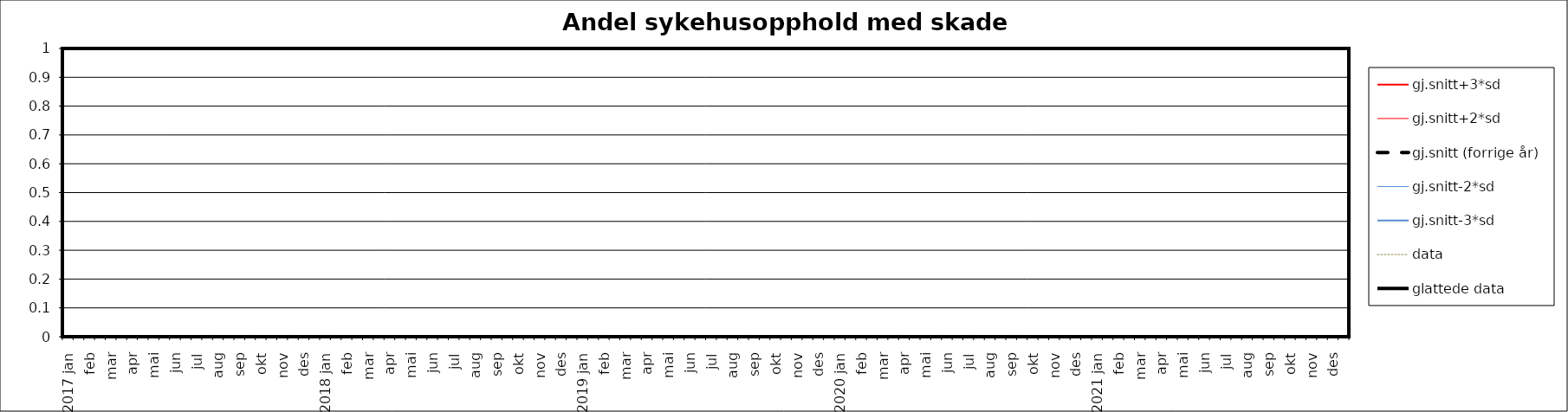
| Category | gj.snitt+3*sd | gj.snitt+2*sd | gj.snitt (forrige år) | gj.snitt-2*sd | gj.snitt-3*sd | data | glattede data |
|---|---|---|---|---|---|---|---|
| 2017 jan | 0 | 0 | 0 | 0 | 0 | 0 | 0 |
|  | 0 | 0 | 0 | 0 | 0 | 0 | 0 |
| feb | 0 | 0 | 0 | 0 | 0 | 0 | 0 |
|  | 0 | 0 | 0 | 0 | 0 | 0 | 0 |
| mar | 0 | 0 | 0 | 0 | 0 | 0 | 0 |
|  | 0 | 0 | 0 | 0 | 0 | 0 | 0 |
| apr | 0 | 0 | 0 | 0 | 0 | 0 | 0 |
|  | 0 | 0 | 0 | 0 | 0 | 0 | 0 |
| mai | 0 | 0 | 0 | 0 | 0 | 0 | 0 |
|  | 0 | 0 | 0 | 0 | 0 | 0 | 0 |
| jun | 0 | 0 | 0 | 0 | 0 | 0 | 0 |
|  | 0 | 0 | 0 | 0 | 0 | 0 | 0 |
| jul | 0 | 0 | 0 | 0 | 0 | 0 | 0 |
|  | 0 | 0 | 0 | 0 | 0 | 0 | 0 |
| aug | 0 | 0 | 0 | 0 | 0 | 0 | 0 |
|  | 0 | 0 | 0 | 0 | 0 | 0 | 0 |
| sep | 0 | 0 | 0 | 0 | 0 | 0 | 0 |
|  | 0 | 0 | 0 | 0 | 0 | 0 | 0 |
| okt | 0 | 0 | 0 | 0 | 0 | 0 | 0 |
|  | 0 | 0 | 0 | 0 | 0 | 0 | 0 |
| nov | 0 | 0 | 0 | 0 | 0 | 0 | 0 |
|  | 0 | 0 | 0 | 0 | 0 | 0 | 0 |
| des | 0 | 0 | 0 | 0 | 0 | 0 | 0 |
|  | 0 | 0 | 0 | 0 | 0 | 0 | 0 |
| 2018 jan | 0 | 0 | 0 | 0 | 0 | 0 | 0 |
|  | 0 | 0 | 0 | 0 | 0 | 0 | 0 |
| feb | 0 | 0 | 0 | 0 | 0 | 0 | 0 |
|  | 0 | 0 | 0 | 0 | 0 | 0 | 0 |
| mar | 0 | 0 | 0 | 0 | 0 | 0 | 0 |
|  | 0 | 0 | 0 | 0 | 0 | 0 | 0 |
| apr | 0 | 0 | 0 | 0 | 0 | 0 | 0 |
|  | 0 | 0 | 0 | 0 | 0 | 0 | 0 |
| mai | 0 | 0 | 0 | 0 | 0 | 0 | 0 |
|  | 0 | 0 | 0 | 0 | 0 | 0 | 0 |
| jun | 0 | 0 | 0 | 0 | 0 | 0 | 0 |
|  | 0 | 0 | 0 | 0 | 0 | 0 | 0 |
| jul | 0 | 0 | 0 | 0 | 0 | 0 | 0 |
|  | 0 | 0 | 0 | 0 | 0 | 0 | 0 |
| aug | 0 | 0 | 0 | 0 | 0 | 0 | 0 |
|  | 0 | 0 | 0 | 0 | 0 | 0 | 0 |
| sep | 0 | 0 | 0 | 0 | 0 | 0 | 0 |
|  | 0 | 0 | 0 | 0 | 0 | 0 | 0 |
| okt | 0 | 0 | 0 | 0 | 0 | 0 | 0 |
|  | 0 | 0 | 0 | 0 | 0 | 0 | 0 |
| nov | 0 | 0 | 0 | 0 | 0 | 0 | 0 |
|  | 0 | 0 | 0 | 0 | 0 | 0 | 0 |
| des | 0 | 0 | 0 | 0 | 0 | 0 | 0 |
|  | 0 | 0 | 0 | 0 | 0 | 0 | 0 |
| 2019 jan | 0 | 0 | 0 | 0 | 0 | 0 | 0 |
|  | 0 | 0 | 0 | 0 | 0 | 0 | 0 |
| feb | 0 | 0 | 0 | 0 | 0 | 0 | 0 |
|  | 0 | 0 | 0 | 0 | 0 | 0 | 0 |
| mar | 0 | 0 | 0 | 0 | 0 | 0 | 0 |
|  | 0 | 0 | 0 | 0 | 0 | 0 | 0 |
| apr | 0 | 0 | 0 | 0 | 0 | 0 | 0 |
|  | 0 | 0 | 0 | 0 | 0 | 0 | 0 |
| mai | 0 | 0 | 0 | 0 | 0 | 0 | 0 |
|  | 0 | 0 | 0 | 0 | 0 | 0 | 0 |
| jun | 0 | 0 | 0 | 0 | 0 | 0 | 0 |
|  | 0 | 0 | 0 | 0 | 0 | 0 | 0 |
| jul | 0 | 0 | 0 | 0 | 0 | 0 | 0 |
|  | 0 | 0 | 0 | 0 | 0 | 0 | 0 |
| aug | 0 | 0 | 0 | 0 | 0 | 0 | 0 |
|  | 0 | 0 | 0 | 0 | 0 | 0 | 0 |
| sep | 0 | 0 | 0 | 0 | 0 | 0 | 0 |
|  | 0 | 0 | 0 | 0 | 0 | 0 | 0 |
| okt | 0 | 0 | 0 | 0 | 0 | 0 | 0 |
|  | 0 | 0 | 0 | 0 | 0 | 0 | 0 |
| nov | 0 | 0 | 0 | 0 | 0 | 0 | 0 |
|  | 0 | 0 | 0 | 0 | 0 | 0 | 0 |
| des | 0 | 0 | 0 | 0 | 0 | 0 | 0 |
|  | 0 | 0 | 0 | 0 | 0 | 0 | 0 |
| 2020 jan | 0 | 0 | 0 | 0 | 0 | 0 | 0 |
|  | 0 | 0 | 0 | 0 | 0 | 0 | 0 |
| feb | 0 | 0 | 0 | 0 | 0 | 0 | 0 |
|  | 0 | 0 | 0 | 0 | 0 | 0 | 0 |
| mar | 0 | 0 | 0 | 0 | 0 | 0 | 0 |
|  | 0 | 0 | 0 | 0 | 0 | 0 | 0 |
| apr | 0 | 0 | 0 | 0 | 0 | 0 | 0 |
|  | 0 | 0 | 0 | 0 | 0 | 0 | 0 |
| mai | 0 | 0 | 0 | 0 | 0 | 0 | 0 |
|  | 0 | 0 | 0 | 0 | 0 | 0 | 0 |
| jun | 0 | 0 | 0 | 0 | 0 | 0 | 0 |
|  | 0 | 0 | 0 | 0 | 0 | 0 | 0 |
| jul | 0 | 0 | 0 | 0 | 0 | 0 | 0 |
|  | 0 | 0 | 0 | 0 | 0 | 0 | 0 |
| aug | 0 | 0 | 0 | 0 | 0 | 0 | 0 |
|  | 0 | 0 | 0 | 0 | 0 | 0 | 0 |
| sep | 0 | 0 | 0 | 0 | 0 | 0 | 0 |
|  | 0 | 0 | 0 | 0 | 0 | 0 | 0 |
| okt | 0 | 0 | 0 | 0 | 0 | 0 | 0 |
|  | 0 | 0 | 0 | 0 | 0 | 0 | 0 |
| nov | 0 | 0 | 0 | 0 | 0 | 0 | 0 |
|  | 0 | 0 | 0 | 0 | 0 | 0 | 0 |
| des | 0 | 0 | 0 | 0 | 0 | 0 | 0 |
|  | 0 | 0 | 0 | 0 | 0 | 0 | 0 |
| 2021 jan | 0 | 0 | 0 | 0 | 0 | 0 | 0 |
|  | 0 | 0 | 0 | 0 | 0 | 0 | 0 |
| feb | 0 | 0 | 0 | 0 | 0 | 0 | 0 |
|  | 0 | 0 | 0 | 0 | 0 | 0 | 0 |
| mar | 0 | 0 | 0 | 0 | 0 | 0 | 0 |
|  | 0 | 0 | 0 | 0 | 0 | 0 | 0 |
| apr | 0 | 0 | 0 | 0 | 0 | 0 | 0 |
|  | 0 | 0 | 0 | 0 | 0 | 0 | 0 |
| mai | 0 | 0 | 0 | 0 | 0 | 0 | 0 |
|  | 0 | 0 | 0 | 0 | 0 | 0 | 0 |
| jun | 0 | 0 | 0 | 0 | 0 | 0 | 0 |
|  | 0 | 0 | 0 | 0 | 0 | 0 | 0 |
| jul | 0 | 0 | 0 | 0 | 0 | 0 | 0 |
|  | 0 | 0 | 0 | 0 | 0 | 0 | 0 |
| aug | 0 | 0 | 0 | 0 | 0 | 0 | 0 |
|  | 0 | 0 | 0 | 0 | 0 | 0 | 0 |
| sep | 0 | 0 | 0 | 0 | 0 | 0 | 0 |
|  | 0 | 0 | 0 | 0 | 0 | 0 | 0 |
| okt | 0 | 0 | 0 | 0 | 0 | 0 | 0 |
|  | 0 | 0 | 0 | 0 | 0 | 0 | 0 |
| nov | 0 | 0 | 0 | 0 | 0 | 0 | 0 |
|  | 0 | 0 | 0 | 0 | 0 | 0 | 0 |
| des | 0 | 0 | 0 | 0 | 0 | 0 | 0 |